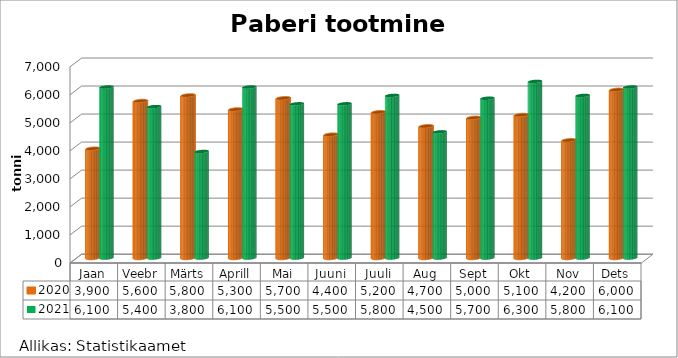
| Category | 2020 | 2021 |
|---|---|---|
| Jaan | 3900 | 6100 |
| Veebr | 5600 | 5400 |
| Märts | 5800 | 3800 |
| Aprill | 5300 | 6100 |
| Mai | 5700 | 5500 |
| Juuni | 4400 | 5500 |
| Juuli | 5200 | 5800 |
| Aug | 4700 | 4500 |
| Sept | 5000 | 5700 |
| Okt | 5100 | 6300 |
| Nov | 4200 | 5800 |
| Dets | 6000 | 6100 |